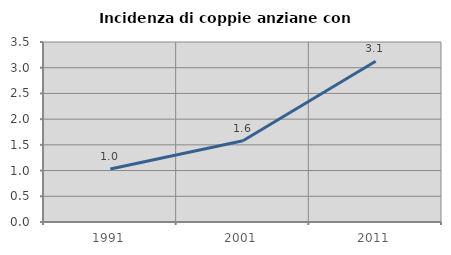
| Category | Incidenza di coppie anziane con figli |
|---|---|
| 1991.0 | 1.029 |
| 2001.0 | 1.58 |
| 2011.0 | 3.124 |